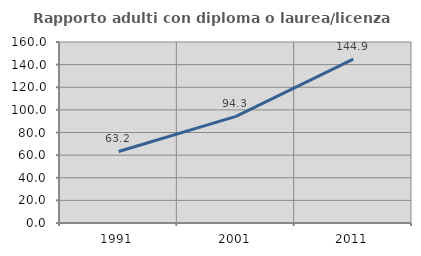
| Category | Rapporto adulti con diploma o laurea/licenza media  |
|---|---|
| 1991.0 | 63.212 |
| 2001.0 | 94.297 |
| 2011.0 | 144.889 |